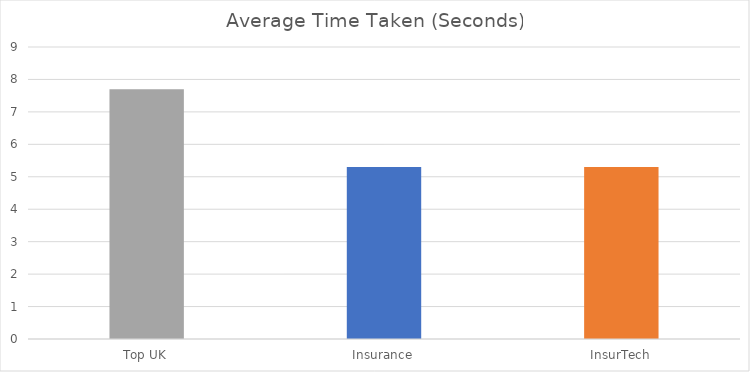
| Category | Time Taken |
|---|---|
| Top UK | 7.7 |
| Insurance | 5.3 |
| InsurTech | 5.3 |